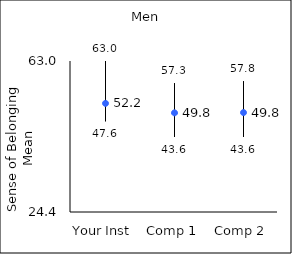
| Category | 25th percentile | 75th percentile | Mean |
|---|---|---|---|
| Your Inst | 47.6 | 63 | 52.17 |
| Comp 1 | 43.6 | 57.3 | 49.75 |
| Comp 2 | 43.6 | 57.8 | 49.82 |